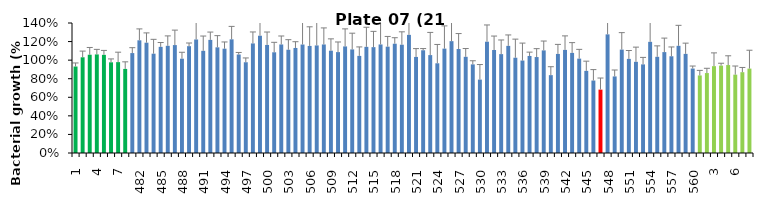
| Category | 21 h % |
|---|---|
| 1.0 | 0.931 |
| 2.0 | 1.031 |
| 3.0 | 1.058 |
| 4.0 | 1.062 |
| 5.0 | 1.057 |
| 6.0 | 0.977 |
| 7.0 | 0.979 |
| 8.0 | 0.906 |
| 481.0 | 1.076 |
| 482.0 | 1.214 |
| 483.0 | 1.188 |
| 484.0 | 1.07 |
| 485.0 | 1.143 |
| 486.0 | 1.154 |
| 487.0 | 1.162 |
| 488.0 | 1.016 |
| 489.0 | 1.15 |
| 490.0 | 1.223 |
| 491.0 | 1.1 |
| 492.0 | 1.218 |
| 493.0 | 1.138 |
| 494.0 | 1.123 |
| 495.0 | 1.224 |
| 496.0 | 1.061 |
| 497.0 | 0.977 |
| 498.0 | 1.18 |
| 499.0 | 1.263 |
| 500.0 | 1.164 |
| 501.0 | 1.085 |
| 502.0 | 1.169 |
| 503.0 | 1.112 |
| 504.0 | 1.131 |
| 505.0 | 1.168 |
| 506.0 | 1.153 |
| 507.0 | 1.158 |
| 508.0 | 1.169 |
| 509.0 | 1.102 |
| 510.0 | 1.087 |
| 511.0 | 1.148 |
| 512.0 | 1.116 |
| 513.0 | 1.046 |
| 514.0 | 1.143 |
| 515.0 | 1.14 |
| 516.0 | 1.169 |
| 517.0 | 1.145 |
| 518.0 | 1.177 |
| 519.0 | 1.166 |
| 520.0 | 1.272 |
| 521.0 | 1.035 |
| 522.0 | 1.106 |
| 523.0 | 1.054 |
| 524.0 | 0.966 |
| 525.0 | 1.124 |
| 526.0 | 1.204 |
| 527.0 | 1.12 |
| 528.0 | 1.036 |
| 529.0 | 0.954 |
| 530.0 | 0.79 |
| 531.0 | 1.199 |
| 532.0 | 1.109 |
| 533.0 | 1.065 |
| 534.0 | 1.154 |
| 535.0 | 1.026 |
| 536.0 | 0.996 |
| 537.0 | 1.045 |
| 538.0 | 1.033 |
| 539.0 | 1.105 |
| 540.0 | 0.839 |
| 541.0 | 1.067 |
| 542.0 | 1.11 |
| 543.0 | 1.078 |
| 544.0 | 1.016 |
| 545.0 | 0.885 |
| 546.0 | 0.781 |
| 547.0 | 0.683 |
| 548.0 | 1.277 |
| 549.0 | 0.825 |
| 550.0 | 1.114 |
| 551.0 | 1.014 |
| 552.0 | 0.982 |
| 553.0 | 0.954 |
| 554.0 | 1.197 |
| 555.0 | 1.036 |
| 556.0 | 1.087 |
| 557.0 | 1.042 |
| 558.0 | 1.154 |
| 559.0 | 1.068 |
| 560.0 | 0.91 |
| 1.0 | 0.835 |
| 2.0 | 0.861 |
| 3.0 | 0.935 |
| 4.0 | 0.941 |
| 5.0 | 0.947 |
| 6.0 | 0.844 |
| 7.0 | 0.87 |
| 8.0 | 0.909 |